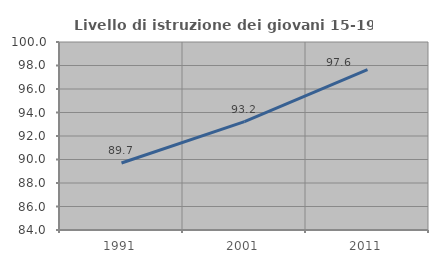
| Category | Livello di istruzione dei giovani 15-19 anni |
|---|---|
| 1991.0 | 89.706 |
| 2001.0 | 93.22 |
| 2011.0 | 97.647 |